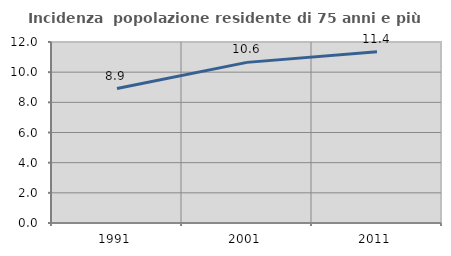
| Category | Incidenza  popolazione residente di 75 anni e più |
|---|---|
| 1991.0 | 8.917 |
| 2001.0 | 10.649 |
| 2011.0 | 11.361 |